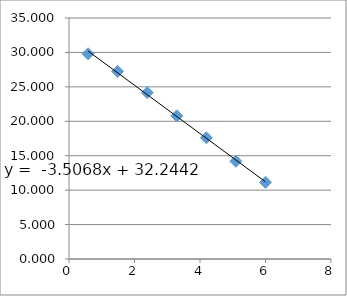
| Category | Series 0 |
|---|---|
| 6.0 | 11.138 |
| 5.096910013008056 | 14.191 |
| 4.193820026016112 | 17.601 |
| 3.290730039024169 | 20.788 |
| 2.387640052032226 | 24.158 |
| 1.484550065040282 | 27.248 |
| 0.581460078048338 | 29.805 |